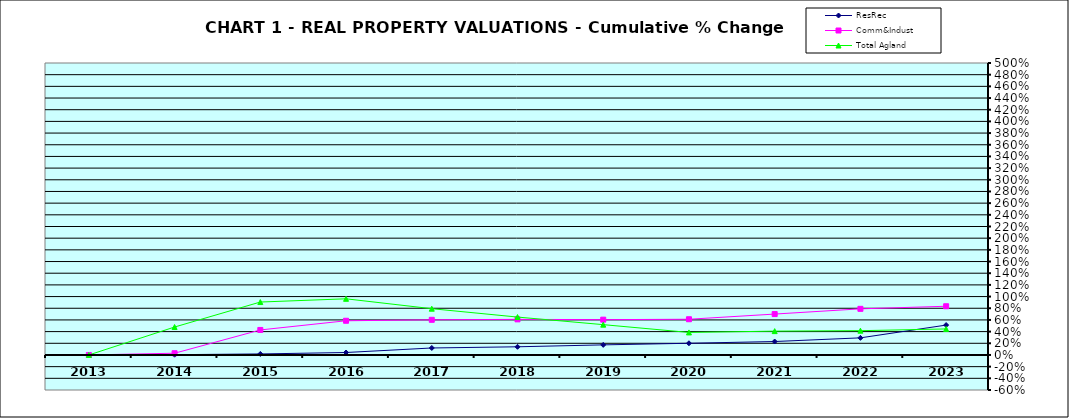
| Category | ResRec | Comm&Indust | Total Agland |
|---|---|---|---|
| 2013.0 | 0 | 0 | 0 |
| 2014.0 | 0.005 | 0.03 | 0.478 |
| 2015.0 | 0.017 | 0.428 | 0.906 |
| 2016.0 | 0.042 | 0.586 | 0.962 |
| 2017.0 | 0.12 | 0.602 | 0.792 |
| 2018.0 | 0.14 | 0.61 | 0.649 |
| 2019.0 | 0.173 | 0.605 | 0.519 |
| 2020.0 | 0.2 | 0.612 | 0.386 |
| 2021.0 | 0.23 | 0.7 | 0.408 |
| 2022.0 | 0.293 | 0.79 | 0.416 |
| 2023.0 | 0.512 | 0.834 | 0.445 |